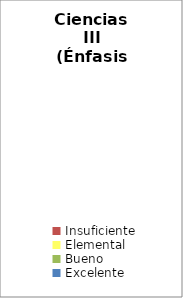
| Category | Ciencias III (Énfasis en Química) |
|---|---|
| Insuficiente | 0 |
| Elemental | 0 |
| Bueno | 0 |
| Excelente | 0 |